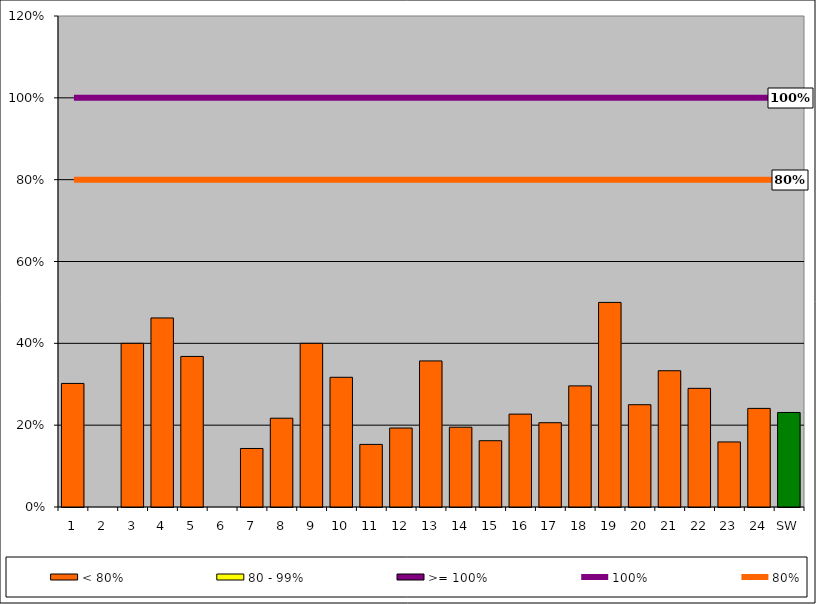
| Category | < 80% | 80 - 99% | >= 100% |
|---|---|---|---|
| 1 | 0.302 | 0 | 0 |
| 2 | 0 | 0 | 0 |
| 3 | 0.4 | 0 | 0 |
| 4 | 0.462 | 0 | 0 |
| 5 | 0.368 | 0 | 0 |
| 6 | 0 | 0 | 0 |
| 7 | 0.143 | 0 | 0 |
| 8 | 0.217 | 0 | 0 |
| 9 | 0.4 | 0 | 0 |
| 10 | 0.317 | 0 | 0 |
| 11 | 0.153 | 0 | 0 |
| 12 | 0.193 | 0 | 0 |
| 13 | 0.357 | 0 | 0 |
| 14 | 0.195 | 0 | 0 |
| 15 | 0.162 | 0 | 0 |
| 16 | 0.227 | 0 | 0 |
| 17 | 0.206 | 0 | 0 |
| 18 | 0.296 | 0 | 0 |
| 19 | 0.5 | 0 | 0 |
| 20 | 0.25 | 0 | 0 |
| 21 | 0.333 | 0 | 0 |
| 22 | 0.29 | 0 | 0 |
| 23 | 0.159 | 0 | 0 |
| 24 | 0.241 | 0 | 0 |
| SW | 0.231 | 0 | 0 |